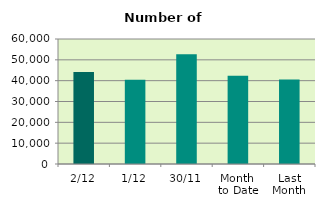
| Category | Series 0 |
|---|---|
| 2/12 | 44198 |
| 1/12 | 40414 |
| 30/11 | 52736 |
| Month 
to Date | 42306 |
| Last
Month | 40546.091 |